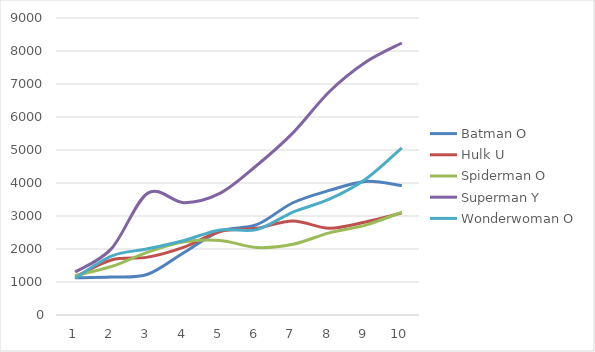
| Category | Batman | Hulk | Spiderman | Superman | Wonderwoman |
|---|---|---|---|---|---|
| 1.0 | 1129 | 1154 | 1196 | 1302 | 1112 |
| 2.0 | 1150 | 1668 | 1469 | 2011 | 1786 |
| 3.0 | 1235 | 1754 | 1906 | 3693 | 2005 |
| 4.0 | 1895 | 2059 | 2220 | 3405 | 2259 |
| 5.0 | 2543 | 2531 | 2260 | 3695 | 2579 |
| 6.0 | 2736 | 2629 | 2046 | 4530 | 2588 |
| 7.0 | 3401 | 2851 | 2143 | 5519 | 3118 |
| 8.0 | 3775 | 2630 | 2489 | 6764 | 3508 |
| 9.0 | 4048 | 2818 | 2725 | 7657 | 4114 |
| 10.0 | 3922 | 3094 | 3118 | 8242 | 5064 |